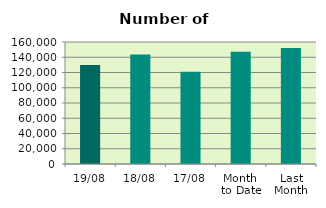
| Category | Series 0 |
|---|---|
| 19/08 | 129774 |
| 18/08 | 143592 |
| 17/08 | 120912 |
| Month 
to Date | 147240 |
| Last
Month | 152026.87 |